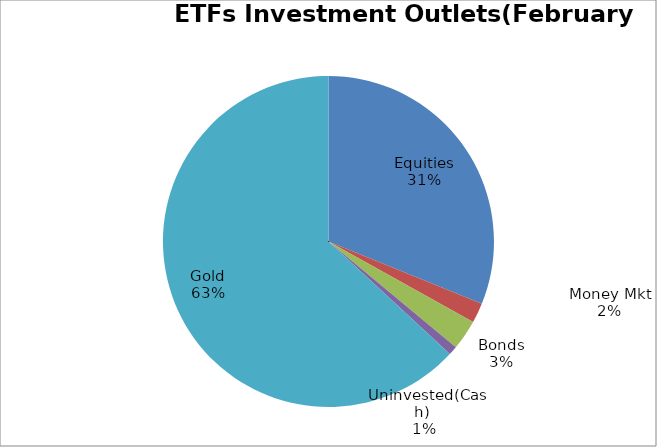
| Category | Series 0 |
|---|---|
| Equities | 5808976392.64 |
| Money Mkt | 363085861.71 |
| Bonds | 548778832.01 |
| Uninvested(Cash) | 163302409.25 |
| Gold | 11768938706.59 |